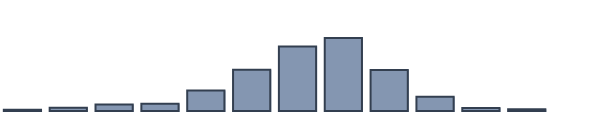
| Category | Series 0 |
|---|---|
| 0 | 0.435 |
| 1 | 1.174 |
| 2 | 2.348 |
| 3 | 2.652 |
| 4 | 7.348 |
| 5 | 14.87 |
| 6 | 23.261 |
| 7 | 26.304 |
| 8 | 14.783 |
| 9 | 5.174 |
| 10 | 1.043 |
| 11 | 0.609 |
| 12 | 0 |